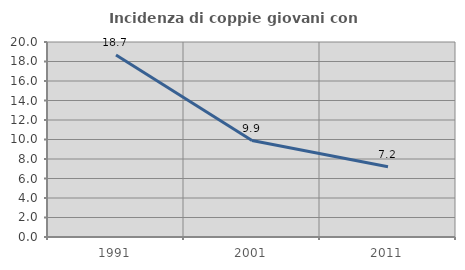
| Category | Incidenza di coppie giovani con figli |
|---|---|
| 1991.0 | 18.675 |
| 2001.0 | 9.888 |
| 2011.0 | 7.199 |